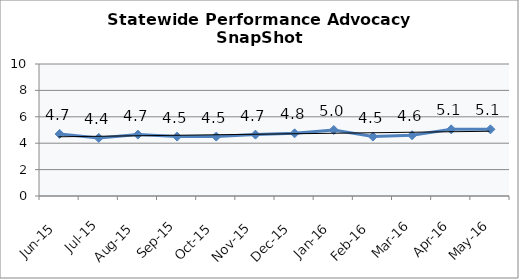
| Category | Statewide |
|---|---|
| Jun-15 | 4.7 |
| Jul-15 | 4.4 |
| Aug-15 | 4.65 |
| Sep-15 | 4.5 |
| Oct-15 | 4.5 |
| Nov-15 | 4.65 |
| Dec-15 | 4.75 |
| Jan-16 | 5 |
| Feb-16 | 4.5 |
| Mar-16 | 4.6 |
| Apr-16 | 5.05 |
| May-16 | 5.05 |